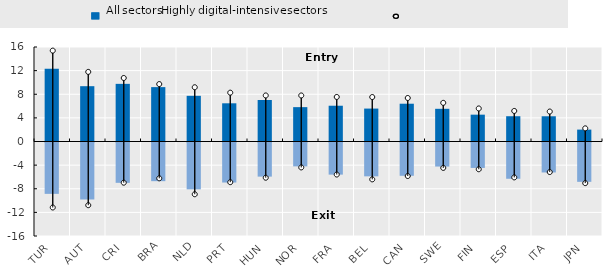
| Category | Entry: other sectors | Exit: other sectors |
|---|---|---|
| TUR | 12.302 | -8.696 |
| AUT | 9.365 | -9.649 |
| CRI | 9.76 | -6.828 |
| BRA | 9.208 | -6.547 |
| NLD | 7.734 | -7.93 |
| PRT | 6.468 | -6.776 |
| HUN | 7.026 | -5.778 |
| NOR | 5.818 | -4.042 |
| FRA | 6.056 | -5.439 |
| BEL | 5.575 | -5.729 |
| CAN | 6.397 | -5.636 |
| SWE | 5.535 | -4.074 |
| FIN | 4.544 | -4.304 |
| ESP | 4.28 | -6.14 |
| ITA | 4.271 | -5.073 |
| JPN | 2.015 | -6.66 |